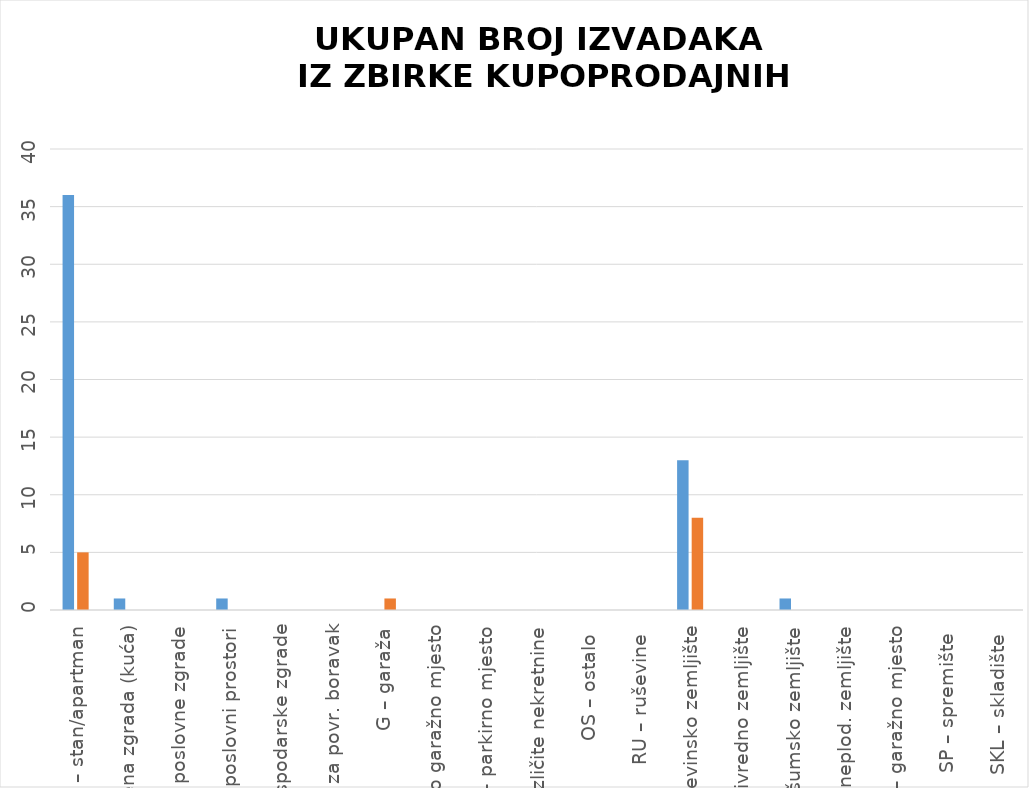
| Category | BROJ IZDANIH IZVADAKA - Zahtjev predan u eNekretninama | BROJ IZDANIH IZVADAKA -  
Zahtjev predan osobno |
|---|---|---|
| ST – stan/apartman | 36 | 5 |
| OK – stambena zgrada (kuća) | 1 | 0 |
| PZG – poslovne zgrade | 0 | 0 |
| PP – poslovni prostori | 1 | 0 |
| GZG – gospodarske zgrade | 0 | 0 |
| VIK – nekretn. za povr. boravak | 0 | 0 |
| G – garaža | 0 | 1 |
| PGM – parkirno garažno mjesto | 0 | 0 |
| VPM – parkirno mjesto | 0 | 0 |
| RN – različite nekretnine | 0 | 0 |
| OS – ostalo  | 0 | 0 |
| RU – ruševine  | 0 | 0 |
| GZ – građevinsko zemljište | 13 | 8 |
| PZ – poljoprivredno zemljište | 0 | 0 |
| ŠZ – šumsko zemljište | 1 | 0 |
| PNZ – prirodno neplod. zemljište | 0 | 0 |
| GM – garažno mjesto | 0 | 0 |
| SP – spremište  | 0 | 0 |
| SKL – skladište  | 0 | 0 |